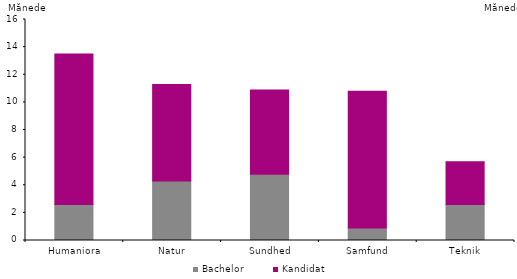
| Category | Bachelor | Kandidat |
|---|---|---|
| Humaniora | 2.6 | 10.9 |
| Natur | 4.3 | 7 |
| Sundhed | 4.8 | 6.1 |
| Samfund | 0.9 | 9.9 |
| Teknik | 2.6 | 3.1 |